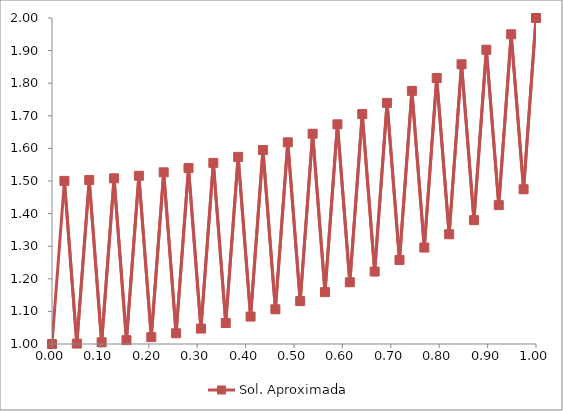
| Category | Sol. Aproximada |
|---|---|
| 0.0 | 1 |
| 0.02564102564102564 | 1.5 |
| 0.05128205128205128 | 1.001 |
| 0.07692307692307693 | 1.503 |
| 0.10256410256410256 | 1.005 |
| 0.1282051282051282 | 1.508 |
| 0.15384615384615383 | 1.012 |
| 0.17948717948717946 | 1.516 |
| 0.2051282051282051 | 1.021 |
| 0.23076923076923073 | 1.527 |
| 0.2564102564102564 | 1.033 |
| 0.28205128205128205 | 1.54 |
| 0.3076923076923077 | 1.047 |
| 0.33333333333333337 | 1.556 |
| 0.35897435897435903 | 1.064 |
| 0.3846153846153847 | 1.574 |
| 0.41025641025641035 | 1.084 |
| 0.435897435897436 | 1.595 |
| 0.4615384615384617 | 1.107 |
| 0.48717948717948734 | 1.619 |
| 0.512820512820513 | 1.131 |
| 0.5384615384615387 | 1.645 |
| 0.5641025641025643 | 1.159 |
| 0.58974358974359 | 1.674 |
| 0.6153846153846156 | 1.189 |
| 0.6410256410256413 | 1.705 |
| 0.666666666666667 | 1.222 |
| 0.6923076923076926 | 1.74 |
| 0.7179487179487183 | 1.258 |
| 0.743589743589744 | 1.776 |
| 0.7692307692307696 | 1.296 |
| 0.7948717948717953 | 1.816 |
| 0.8205128205128209 | 1.337 |
| 0.8461538461538466 | 1.858 |
| 0.8717948717948723 | 1.38 |
| 0.8974358974358979 | 1.903 |
| 0.9230769230769236 | 1.426 |
| 0.9487179487179492 | 1.95 |
| 0.9743589743589749 | 1.475 |
| 1.0000000000000004 | 2 |